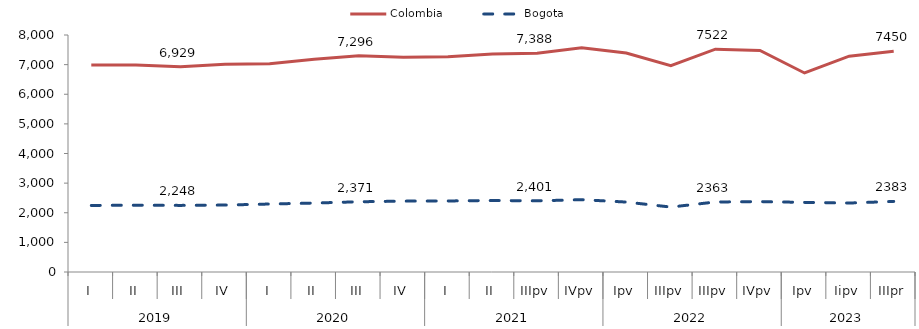
| Category | Colombia | Bogota |
|---|---|---|
| 0 | 6986.028 | 2247.095 |
| 1 | 6987.888 | 2255.594 |
| 2 | 6928.501 | 2248.39 |
| 3 | 7012.46 | 2259.472 |
| 4 | 7031.197 | 2294.598 |
| 5 | 7183.975 | 2327.144 |
| 6 | 7295.907 | 2370.6 |
| 7 | 7248.026 | 2392.098 |
| 8 | 7266.897 | 2398.201 |
| 9 | 7361.573 | 2413.932 |
| 10 | 7387.8 | 2401.222 |
| 11 | 7567.395 | 2441.157 |
| 12 | 7389.409 | 2360.788 |
| 13 | 6965.905 | 2191.852 |
| 14 | 7522.348 | 2363.248 |
| 15 | 7480.41 | 2375.82 |
| 16 | 6718 | 2350 |
| 17 | 7286.247 | 2327.391 |
| 18 | 7450 | 2383 |